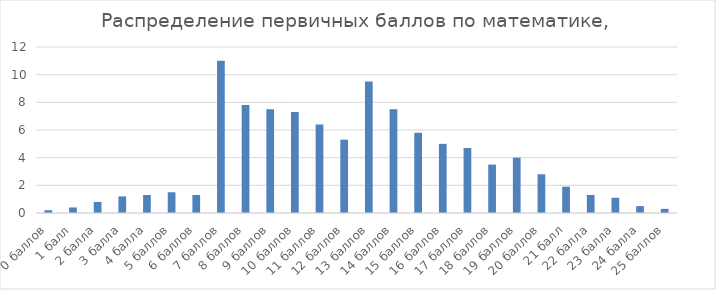
| Category | Series 0 |
|---|---|
| 0 баллов | 0.2 |
| 1 балл | 0.4 |
| 2 балла | 0.8 |
| 3 балла | 1.2 |
| 4 балла | 1.3 |
| 5 баллов | 1.5 |
| 6 баллов | 1.3 |
| 7 баллов | 11 |
| 8 баллов | 7.8 |
| 9 баллов | 7.5 |
| 10 баллов | 7.3 |
| 11 баллов | 6.4 |
| 12 баллов | 5.3 |
| 13 баллов | 9.5 |
| 14 баллов | 7.5 |
| 15 баллов | 5.8 |
| 16 баллов | 5 |
| 17 баллов | 4.7 |
| 18 баллов | 3.5 |
| 19 баллов | 4 |
| 20 баллов | 2.8 |
| 21 балл | 1.9 |
| 22 балла | 1.3 |
| 23 балла | 1.1 |
| 24 балла | 0.5 |
| 25 баллов | 0.3 |